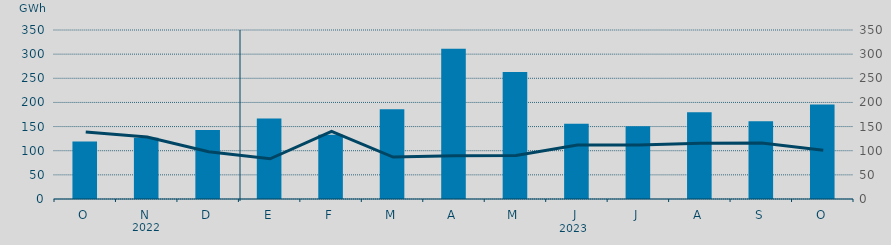
| Category | Energía a subir |
|---|---|
| O | 118.914 |
| N | 126.653 |
| D | 143.004 |
| E | 166.862 |
| F | 132.923 |
| M | 185.844 |
| A | 310.964 |
| M | 263.086 |
| J | 155.797 |
| J | 150.424 |
| A | 179.728 |
| S | 160.778 |
| O | 195.651 |